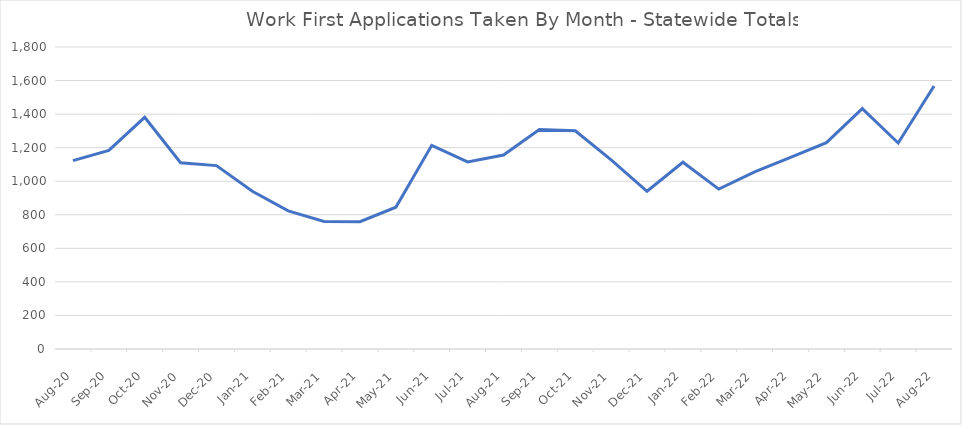
| Category | Series 0 |
|---|---|
| 2022-08-22 | 1568 |
| 2022-07-22 | 1228 |
| 2022-06-01 | 1433 |
| 2022-05-01 | 1230 |
| 2022-04-01 | 1142 |
| 2022-03-01 | 1056 |
| 2022-02-01 | 953 |
| 2022-01-01 | 1113 |
| 2021-12-02 | 940 |
| 2021-11-01 | 1127 |
| 2021-10-01 | 1301 |
| 2021-09-01 | 1308 |
| 2021-08-01 | 1156 |
| 2021-07-01 | 1115 |
| 2021-06-01 | 1214 |
| 2021-05-01 | 845 |
| 2021-04-01 | 759 |
| 2021-03-01 | 760 |
| 2021-02-01 | 823 |
| 2021-01-01 | 940 |
| 2020-12-01 | 1093 |
| 2020-11-01 | 1110 |
| 2020-10-01 | 1381 |
| 2020-09-01 | 1184 |
| 2020-08-01 | 1123 |